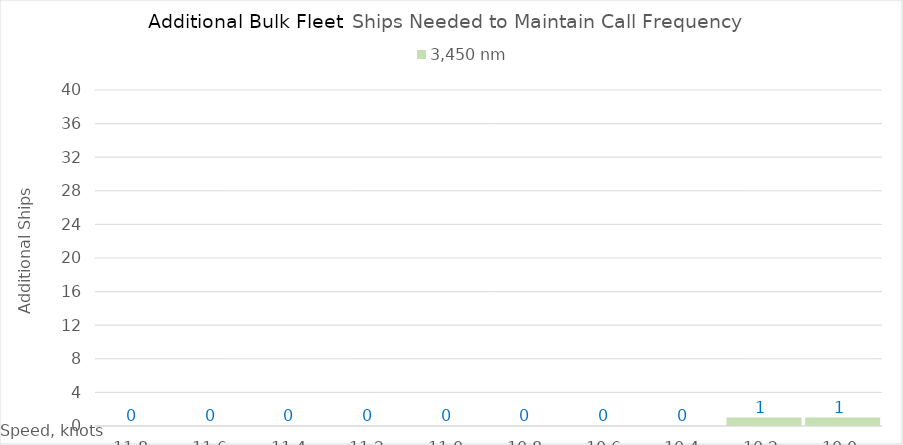
| Category | 3,450 |
|---|---|
| 11.8 | 0 |
| 11.600000000000001 | 0 |
| 11.400000000000002 | 0 |
| 11.200000000000003 | 0 |
| 11.000000000000004 | 0 |
| 10.800000000000004 | 0 |
| 10.600000000000005 | 0 |
| 10.400000000000006 | 0 |
| 10.200000000000006 | 1 |
| 10.000000000000007 | 1 |